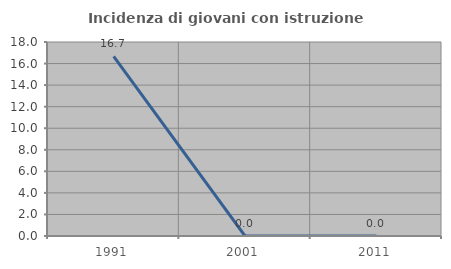
| Category | Incidenza di giovani con istruzione universitaria |
|---|---|
| 1991.0 | 16.667 |
| 2001.0 | 0 |
| 2011.0 | 0 |